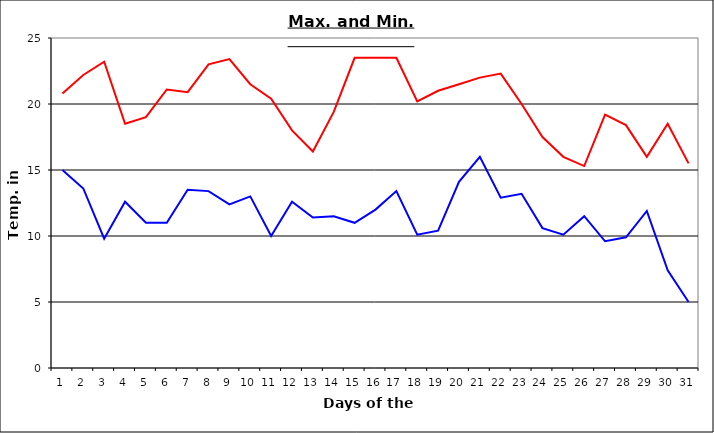
| Category | Series 0 | Series 1 |
|---|---|---|
| 0 | 20.8 | 15 |
| 1 | 22.2 | 13.6 |
| 2 | 23.2 | 9.8 |
| 3 | 18.5 | 12.6 |
| 4 | 19 | 11 |
| 5 | 21.1 | 11 |
| 6 | 20.9 | 13.5 |
| 7 | 23 | 13.4 |
| 8 | 23.4 | 12.4 |
| 9 | 21.5 | 13 |
| 10 | 20.4 | 10 |
| 11 | 18 | 12.6 |
| 12 | 16.4 | 11.4 |
| 13 | 19.4 | 11.5 |
| 14 | 23.5 | 11 |
| 15 | 23.5 | 12 |
| 16 | 23.5 | 13.4 |
| 17 | 20.2 | 10.1 |
| 18 | 21 | 10.4 |
| 19 | 21.5 | 14.1 |
| 20 | 22 | 16 |
| 21 | 22.3 | 12.9 |
| 22 | 20 | 13.2 |
| 23 | 17.5 | 10.6 |
| 24 | 16 | 10.1 |
| 25 | 15.3 | 11.5 |
| 26 | 19.2 | 9.6 |
| 27 | 18.4 | 9.9 |
| 28 | 16 | 11.9 |
| 29 | 18.5 | 7.4 |
| 30 | 15.5 | 5 |